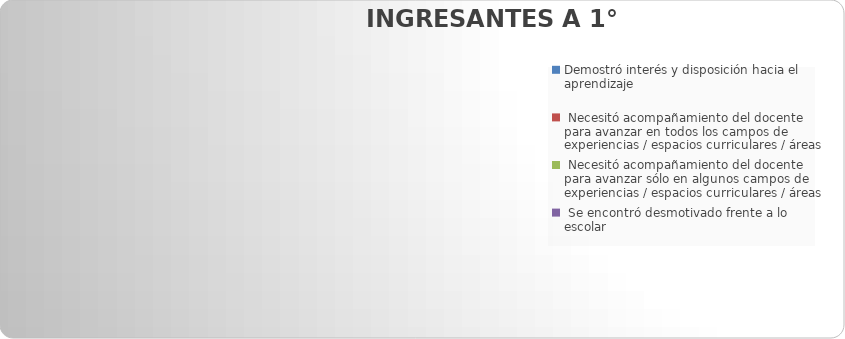
| Category | Demostró interés y disposición hacia el aprendizaje |
|---|---|
| Demostró interés y disposición hacia el aprendizaje | 0 |
|  Necesitó acompañamiento del docente para avanzar en todos los campos de experiencias / espacios curriculares / áreas | 0 |
|  Necesitó acompañamiento del docente para avanzar sólo en algunos campos de experiencias / espacios curriculares / áreas  | 0 |
|  Se encontró desmotivado frente a lo escolar | 0 |